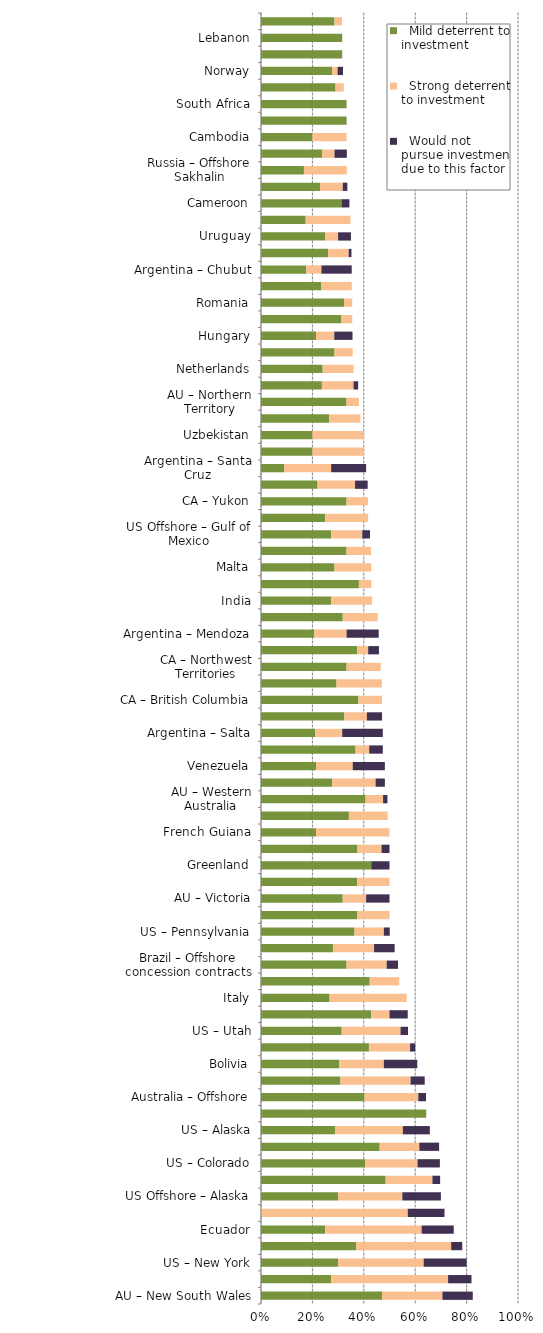
| Category |   Mild deterrent to investment |   Strong deterrent to investment |   Would not pursue investment due to this factor |
|---|---|---|---|
| AU – New South Wales | 0.471 | 0.235 | 0.118 |
| CA – Quebec | 0.273 | 0.455 | 0.091 |
| US – New York | 0.3 | 0.333 | 0.167 |
| US – California | 0.37 | 0.37 | 0.043 |
| Ecuador | 0.25 | 0.375 | 0.125 |
| US Offshore – Pacific | 0 | 0.571 | 0.143 |
| US Offshore – Alaska | 0.3 | 0.25 | 0.15 |
| AU – Queensland | 0.485 | 0.182 | 0.03 |
| US – Colorado | 0.406 | 0.203 | 0.087 |
| Guatemala | 0.462 | 0.154 | 0.077 |
| US – Alaska | 0.289 | 0.263 | 0.105 |
| Greece | 0.643 | 0 | 0 |
| Australia – Offshore | 0.403 | 0.209 | 0.03 |
| Peru | 0.309 | 0.273 | 0.055 |
| Bolivia | 0.304 | 0.174 | 0.13 |
| US – New Mexico | 0.42 | 0.16 | 0.02 |
| US – Utah | 0.314 | 0.229 | 0.029 |
| CA – New Brunswick | 0.429 | 0.071 | 0.071 |
| Italy | 0.267 | 0.3 | 0 |
| US – Michigan | 0.423 | 0.115 | 0 |
| Brazil – Offshore concession contracts | 0.333 | 0.156 | 0.044 |
| France | 0.28 | 0.16 | 0.08 |
| US – Pennsylvania | 0.364 | 0.114 | 0.023 |
| AU – Tasmania | 0.375 | 0.125 | 0 |
| AU – Victoria | 0.318 | 0.091 | 0.091 |
| Timor Gap (JPDA) | 0.375 | 0.125 | 0 |
| Greenland | 0.429 | 0 | 0.071 |
| Brazil – Onshore concession contracts | 0.375 | 0.094 | 0.031 |
| French Guiana | 0.214 | 0.286 | 0 |
| US – Wyoming | 0.342 | 0.151 | 0 |
| AU – Western Australia | 0.407 | 0.068 | 0.017 |
| Colombia | 0.277 | 0.169 | 0.036 |
| Venezuela | 0.214 | 0.143 | 0.125 |
| Russia – Eastern Siberia | 0.368 | 0.053 | 0.053 |
| Argentina – Salta | 0.211 | 0.105 | 0.158 |
| Brazil – Offshore presalt area profit sharing contracts | 0.324 | 0.088 | 0.059 |
| CA – British Columbia | 0.379 | 0.092 | 0 |
| Iran | 0.294 | 0.176 | 0 |
| CA – Northwest Territories | 0.333 | 0.133 | 0 |
| AU – South Australia | 0.375 | 0.042 | 0.042 |
| Argentina – Mendoza | 0.208 | 0.125 | 0.125 |
| Spain – Offshore | 0.318 | 0.136 | 0 |
| India | 0.273 | 0.159 | 0 |
| US – Illinois | 0.381 | 0.048 | 0 |
| Malta | 0.286 | 0.143 | 0 |
| Spain – Onshore | 0.333 | 0.095 | 0 |
| US Offshore – Gulf of Mexico | 0.273 | 0.121 | 0.03 |
| Bulgaria | 0.25 | 0.167 | 0 |
| CA – Yukon | 0.333 | 0.083 | 0 |
| New Zealand | 0.22 | 0.146 | 0.049 |
| Argentina – Santa Cruz | 0.091 | 0.182 | 0.136 |
| Russia –  Offshore Arctic | 0.2 | 0.2 | 0 |
| Uzbekistan | 0.2 | 0.2 | 0 |
| US – Montana | 0.265 | 0.122 | 0 |
| AU – Northern Territory | 0.333 | 0.048 | 0 |
| Indonesia | 0.237 | 0.123 | 0.018 |
| Netherlands | 0.24 | 0.12 | 0 |
| Japan | 0.286 | 0.071 | 0 |
| Hungary | 0.214 | 0.071 | 0.071 |
| CA – Alberta | 0.313 | 0.042 | 0 |
| Romania | 0.323 | 0.032 | 0 |
| Ukraine | 0.235 | 0.118 | 0 |
| Argentina – Chubut | 0.176 | 0.059 | 0.118 |
| United Kingdom | 0.261 | 0.08 | 0.011 |
| Uruguay | 0.25 | 0.05 | 0.05 |
| Germany | 0.174 | 0.174 | 0 |
| Cameroon | 0.313 | 0 | 0.031 |
| US – Louisiana | 0.23 | 0.088 | 0.018 |
| Russia – Offshore Sakhalin | 0.167 | 0.167 | 0 |
| Uganda | 0.238 | 0.048 | 0.048 |
| Cambodia | 0.2 | 0.133 | 0 |
| Somaliland | 0.333 | 0 | 0 |
| South Africa | 0.333 | 0 | 0 |
| Turkey | 0.29 | 0.032 | 0 |
| Norway | 0.277 | 0.021 | 0.021 |
| Bangladesh | 0.316 | 0 | 0 |
| Lebanon | 0.316 | 0 | 0 |
| US – Ohio | 0.286 | 0.029 | 0 |